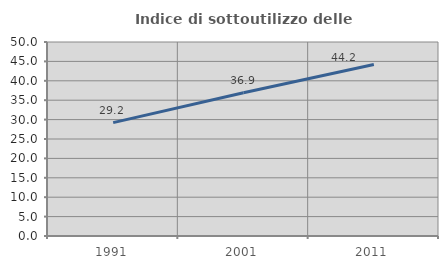
| Category | Indice di sottoutilizzo delle abitazioni  |
|---|---|
| 1991.0 | 29.23 |
| 2001.0 | 36.919 |
| 2011.0 | 44.22 |